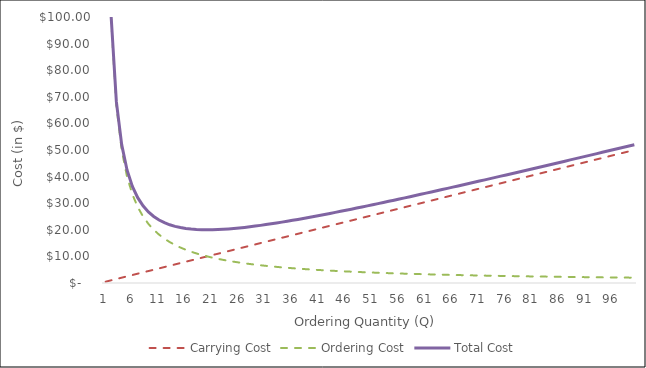
| Category | Carrying Cost | Ordering Cost | Total Cost |
|---|---|---|---|
| 0 | 0.5 | 200 | 200.5 |
| 1 | 1 | 100 | 101 |
| 2 | 1.5 | 66.667 | 68.167 |
| 3 | 2 | 50 | 52 |
| 4 | 2.5 | 40 | 42.5 |
| 5 | 3 | 33.333 | 36.333 |
| 6 | 3.5 | 28.571 | 32.071 |
| 7 | 4 | 25 | 29 |
| 8 | 4.5 | 22.222 | 26.722 |
| 9 | 5 | 20 | 25 |
| 10 | 5.5 | 18.182 | 23.682 |
| 11 | 6 | 16.667 | 22.667 |
| 12 | 6.5 | 15.385 | 21.885 |
| 13 | 7 | 14.286 | 21.286 |
| 14 | 7.5 | 13.333 | 20.833 |
| 15 | 8 | 12.5 | 20.5 |
| 16 | 8.5 | 11.765 | 20.265 |
| 17 | 9 | 11.111 | 20.111 |
| 18 | 9.5 | 10.526 | 20.026 |
| 19 | 10 | 10 | 20 |
| 20 | 10.5 | 9.524 | 20.024 |
| 21 | 11 | 9.091 | 20.091 |
| 22 | 11.5 | 8.696 | 20.196 |
| 23 | 12 | 8.333 | 20.333 |
| 24 | 12.5 | 8 | 20.5 |
| 25 | 13 | 7.692 | 20.692 |
| 26 | 13.5 | 7.407 | 20.907 |
| 27 | 14 | 7.143 | 21.143 |
| 28 | 14.5 | 6.897 | 21.397 |
| 29 | 15 | 6.667 | 21.667 |
| 30 | 15.5 | 6.452 | 21.952 |
| 31 | 16 | 6.25 | 22.25 |
| 32 | 16.5 | 6.061 | 22.561 |
| 33 | 17 | 5.882 | 22.882 |
| 34 | 17.5 | 5.714 | 23.214 |
| 35 | 18 | 5.556 | 23.556 |
| 36 | 18.5 | 5.405 | 23.905 |
| 37 | 19 | 5.263 | 24.263 |
| 38 | 19.5 | 5.128 | 24.628 |
| 39 | 20 | 5 | 25 |
| 40 | 20.5 | 4.878 | 25.378 |
| 41 | 21 | 4.762 | 25.762 |
| 42 | 21.5 | 4.651 | 26.151 |
| 43 | 22 | 4.545 | 26.545 |
| 44 | 22.5 | 4.444 | 26.944 |
| 45 | 23 | 4.348 | 27.348 |
| 46 | 23.5 | 4.255 | 27.755 |
| 47 | 24 | 4.167 | 28.167 |
| 48 | 24.5 | 4.082 | 28.582 |
| 49 | 25 | 4 | 29 |
| 50 | 25.5 | 3.922 | 29.422 |
| 51 | 26 | 3.846 | 29.846 |
| 52 | 26.5 | 3.774 | 30.274 |
| 53 | 27 | 3.704 | 30.704 |
| 54 | 27.5 | 3.636 | 31.136 |
| 55 | 28 | 3.571 | 31.571 |
| 56 | 28.5 | 3.509 | 32.009 |
| 57 | 29 | 3.448 | 32.448 |
| 58 | 29.5 | 3.39 | 32.89 |
| 59 | 30 | 3.333 | 33.333 |
| 60 | 30.5 | 3.279 | 33.779 |
| 61 | 31 | 3.226 | 34.226 |
| 62 | 31.5 | 3.175 | 34.675 |
| 63 | 32 | 3.125 | 35.125 |
| 64 | 32.5 | 3.077 | 35.577 |
| 65 | 33 | 3.03 | 36.03 |
| 66 | 33.5 | 2.985 | 36.485 |
| 67 | 34 | 2.941 | 36.941 |
| 68 | 34.5 | 2.899 | 37.399 |
| 69 | 35 | 2.857 | 37.857 |
| 70 | 35.5 | 2.817 | 38.317 |
| 71 | 36 | 2.778 | 38.778 |
| 72 | 36.5 | 2.74 | 39.24 |
| 73 | 37 | 2.703 | 39.703 |
| 74 | 37.5 | 2.667 | 40.167 |
| 75 | 38 | 2.632 | 40.632 |
| 76 | 38.5 | 2.597 | 41.097 |
| 77 | 39 | 2.564 | 41.564 |
| 78 | 39.5 | 2.532 | 42.032 |
| 79 | 40 | 2.5 | 42.5 |
| 80 | 40.5 | 2.469 | 42.969 |
| 81 | 41 | 2.439 | 43.439 |
| 82 | 41.5 | 2.41 | 43.91 |
| 83 | 42 | 2.381 | 44.381 |
| 84 | 42.5 | 2.353 | 44.853 |
| 85 | 43 | 2.326 | 45.326 |
| 86 | 43.5 | 2.299 | 45.799 |
| 87 | 44 | 2.273 | 46.273 |
| 88 | 44.5 | 2.247 | 46.747 |
| 89 | 45 | 2.222 | 47.222 |
| 90 | 45.5 | 2.198 | 47.698 |
| 91 | 46 | 2.174 | 48.174 |
| 92 | 46.5 | 2.151 | 48.651 |
| 93 | 47 | 2.128 | 49.128 |
| 94 | 47.5 | 2.105 | 49.605 |
| 95 | 48 | 2.083 | 50.083 |
| 96 | 48.5 | 2.062 | 50.562 |
| 97 | 49 | 2.041 | 51.041 |
| 98 | 49.5 | 2.02 | 51.52 |
| 99 | 50 | 2 | 52 |